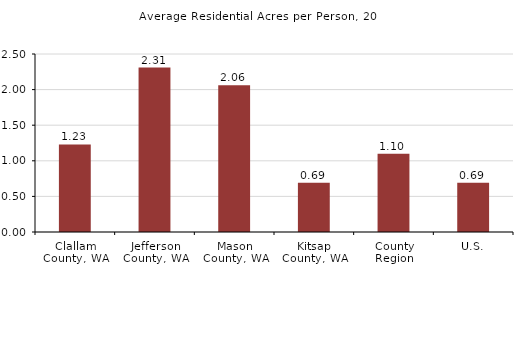
| Category | Residential Acres/Person, 2010 |
|---|---|
| Clallam County, WA | 1.23 |
| Jefferson County, WA | 2.31 |
| Mason County, WA | 2.06 |
| Kitsap County, WA | 0.69 |
| County Region | 1.1 |
| U.S. | 0.69 |